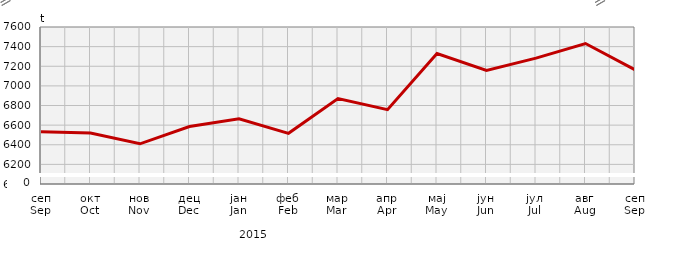
| Category | Прикупљање крављег млијека
Collecting of cow’s milk |
|---|---|
| сеп
Sep | 6532.974 |
| окт
Oct | 6519.778 |
| нов
Nov | 6409.6 |
| дец
Dec | 6585.351 |
| јан
Jan | 6663.893 |
| феб
Feb | 6516.44 |
| мар
Mar | 6870.8 |
| апр
Apr | 6757.289 |
| мај
May | 7329.328 |
| јун
Jun | 7158.306 |
| јул
Jul | 7282.65 |
| авг
Aug | 7431.863 |
| сеп
Sep | 7163.964 |